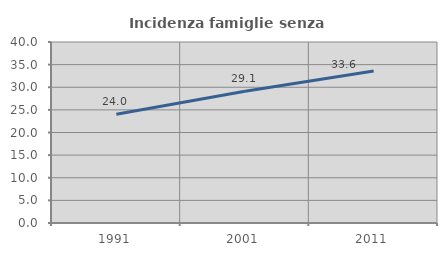
| Category | Incidenza famiglie senza nuclei |
|---|---|
| 1991.0 | 24.038 |
| 2001.0 | 29.102 |
| 2011.0 | 33.575 |